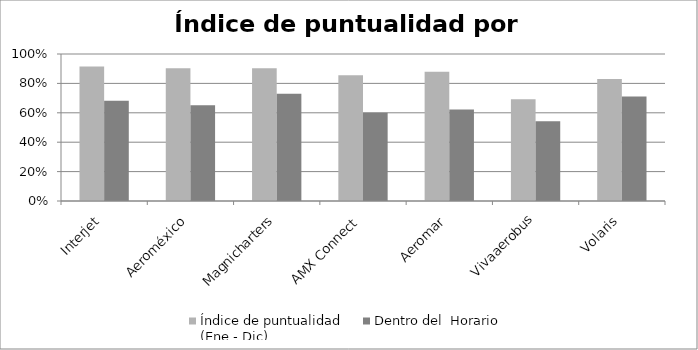
| Category | Índice de puntualidad
(Ene - Dic) | Dentro del  Horario |
|---|---|---|
| Interjet | 0.915 | 0.683 |
| Aeroméxico | 0.902 | 0.651 |
| Magnicharters | 0.902 | 0.73 |
| AMX Connect | 0.856 | 0.601 |
| Aeromar | 0.879 | 0.623 |
| Vivaaerobus | 0.691 | 0.543 |
| Volaris | 0.83 | 0.71 |